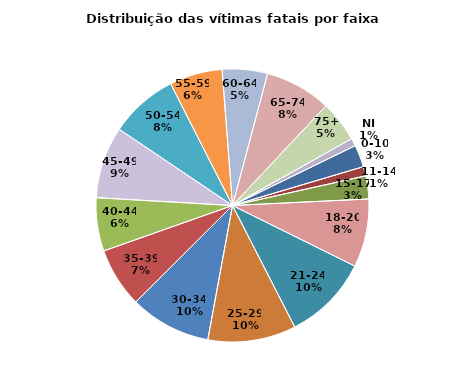
| Category | Series 0 |
|---|---|
| 0-10 | 55 |
| 11-14 | 23 |
| 15-17 | 57 |
| 18-20 | 169 |
| 21-24 | 212 |
| 25-29 | 218 |
| 30-34 | 201 |
| 35-39 | 148 |
| 40-44 | 132 |
| 45-49 | 178 |
| 50-54 | 169 |
| 55-59 | 131 |
| 60-64 | 112 |
| 65-74 | 164 |
| 75+ | 102 |
| NI | 19 |